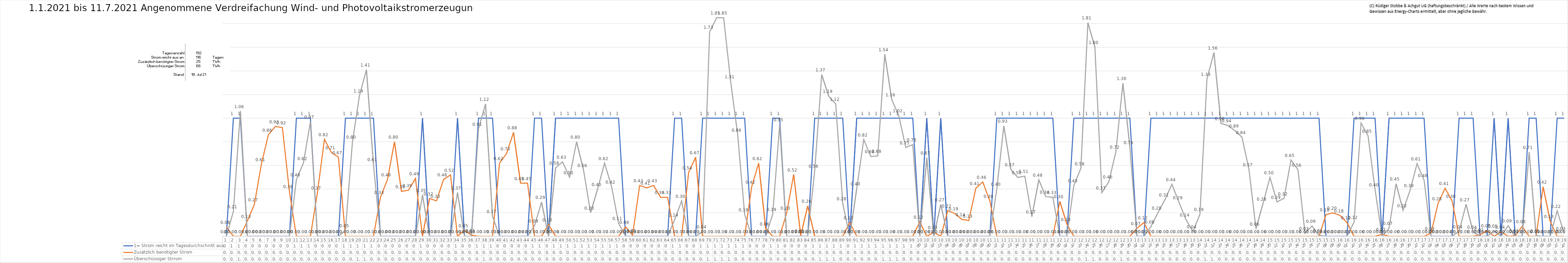
| Category | 1= Strom reicht im Tagesdurchschnitt aus | Zusätzlich benötigter Strom | Überschüssiger Strrom |
|---|---|---|---|
| 0 | 0 | 0.08 | 0 |
| 1 | 1 | 0 | 0.21 |
| 2 | 1 | 0 | 1.06 |
| 3 | 0 | 0.13 | 0 |
| 4 | 0 | 0.27 | 0 |
| 5 | 0 | 0.61 | 0 |
| 6 | 0 | 0.86 | 0 |
| 7 | 0 | 0.93 | 0 |
| 8 | 0 | 0.92 | 0 |
| 9 | 0 | 0.38 | 0 |
| 10 | 1 | 0 | 0.48 |
| 11 | 1 | 0 | 0.62 |
| 12 | 1 | 0 | 0.97 |
| 13 | 0 | 0.37 | 0 |
| 14 | 0 | 0.82 | 0 |
| 15 | 0 | 0.71 | 0 |
| 16 | 0 | 0.67 | 0 |
| 17 | 1 | 0 | 0.05 |
| 18 | 1 | 0 | 0.8 |
| 19 | 1 | 0 | 1.19 |
| 20 | 1 | 0 | 1.41 |
| 21 | 1 | 0 | 0.61 |
| 22 | 0 | 0.33 | 0 |
| 23 | 0 | 0.48 | 0 |
| 24 | 0 | 0.8 | 0 |
| 25 | 0 | 0.38 | 0 |
| 26 | 0 | 0.39 | 0 |
| 27 | 0 | 0.49 | 0 |
| 28 | 1 | 0 | 0.35 |
| 29 | 0 | 0.32 | 0 |
| 30 | 0 | 0.3 | 0 |
| 31 | 0 | 0.48 | 0 |
| 32 | 0 | 0.52 | 0 |
| 33 | 1 | 0 | 0.37 |
| 34 | 0 | 0.05 | 0 |
| 35 | 0 | 0.01 | 0 |
| 36 | 1 | 0 | 0.91 |
| 37 | 1 | 0 | 1.12 |
| 38 | 1 | 0 | 0.17 |
| 39 | 0 | 0.62 | 0 |
| 40 | 0 | 0.7 | 0 |
| 41 | 0 | 0.88 | 0 |
| 42 | 0 | 0.45 | 0 |
| 43 | 0 | 0.45 | 0 |
| 44 | 1 | 0 | 0.09 |
| 45 | 1 | 0 | 0.29 |
| 46 | 0 | 0.1 | 0 |
| 47 | 1 | 0 | 0.58 |
| 48 | 1 | 0 | 0.63 |
| 49 | 1 | 0 | 0.5 |
| 50 | 1 | 0 | 0.8 |
| 51 | 1 | 0 | 0.56 |
| 52 | 1 | 0 | 0.2 |
| 53 | 1 | 0 | 0.4 |
| 54 | 1 | 0 | 0.62 |
| 55 | 1 | 0 | 0.42 |
| 56 | 1 | 0 | 0.11 |
| 57 | 0 | 0.08 | 0 |
| 58 | 0 | 0.01 | 0 |
| 59 | 0 | 0.43 | 0 |
| 60 | 0 | 0.41 | 0 |
| 61 | 0 | 0.43 | 0 |
| 62 | 0 | 0.33 | 0 |
| 63 | 0 | 0.33 | 0 |
| 64 | 1 | 0 | 0.14 |
| 65 | 1 | 0 | 0.3 |
| 66 | 0 | 0.54 | 0 |
| 67 | 0 | 0.67 | 0 |
| 68 | 1 | 0 | 0.04 |
| 69 | 1 | 0 | 1.73 |
| 70 | 1 | 0 | 1.85 |
| 71 | 1 | 0 | 1.85 |
| 72 | 1 | 0 | 1.31 |
| 73 | 1 | 0 | 0.861 |
| 74 | 1 | 0 | 0.185 |
| 75 | 0 | 0.42 | 0 |
| 76 | 0 | 0.619 | 0 |
| 77 | 0 | 0.064 | 0 |
| 78 | 1 | 0 | 0.187 |
| 79 | 1 | 0 | 0.946 |
| 80 | 0 | 0.198 | 0 |
| 81 | 0 | 0.523 | 0 |
| 82 | 0 | 0.007 | 0 |
| 83 | 0 | 0.257 | 0 |
| 84 | 1 | 0 | 0.555 |
| 85 | 1 | 0 | 1.369 |
| 86 | 1 | 0 | 1.186 |
| 87 | 1 | 0 | 1.12 |
| 88 | 1 | 0 | 0.278 |
| 89 | 0 | 0.117 | 0 |
| 90 | 1 | 0 | 0.403 |
| 91 | 1 | 0 | 0.819 |
| 92 | 1 | 0 | 0.676 |
| 93 | 1 | 0 | 0.681 |
| 94 | 1 | 0 | 1.541 |
| 95 | 1 | 0 | 1.158 |
| 96 | 1 | 0 | 1.022 |
| 97 | 1 | 0 | 0.752 |
| 98 | 1 | 0 | 0.776 |
| 99 | 0 | 0.123 | 0 |
| 100 | 1 | 0 | 0.665 |
| 101 | 0 | 0.034 | 0 |
| 102 | 1 | 0 | 0.269 |
| 103 | 0 | 0.218 | 0 |
| 104 | 0 | 0.193 | 0 |
| 105 | 0 | 0.144 | 0 |
| 106 | 0 | 0.133 | 0 |
| 107 | 0 | 0.407 | 0 |
| 108 | 0 | 0.46 | 0 |
| 109 | 0 | 0.3 | 0 |
| 110 | 1 | 0 | 0.402 |
| 111 | 1 | 0 | 0.934 |
| 112 | 1 | 0 | 0.567 |
| 113 | 1 | 0 | 0.498 |
| 114 | 1 | 0 | 0.509 |
| 115 | 1 | 0 | 0.167 |
| 116 | 1 | 0 | 0.478 |
| 117 | 1 | 0 | 0.336 |
| 118 | 1 | 0 | 0.331 |
| 119 | 0 | 0.296 | 0 |
| 120 | 0 | 0.103 | 0 |
| 121 | 1 | 0 | 0.432 |
| 122 | 1 | 0 | 0.575 |
| 123 | 1 | 0 | 1.808 |
| 124 | 1 | 0 | 1.602 |
| 125 | 1 | 0 | 0.369 |
| 126 | 1 | 0 | 0.463 |
| 127 | 1 | 0 | 0.716 |
| 128 | 1 | 0 | 1.296 |
| 129 | 1 | 0 | 0.755 |
| 130 | 0 | 0.067 | 0 |
| 131 | 0 | 0.117 | 0 |
| 132 | 1 | 0 | 0.081 |
| 133 | 1 | 0 | 0.2 |
| 134 | 1 | 0 | 0.31 |
| 135 | 1 | 0 | 0.44 |
| 136 | 1 | 0 | 0.289 |
| 137 | 1 | 0 | 0.142 |
| 138 | 1 | 0 | 0.041 |
| 139 | 1 | 0 | 0.186 |
| 140 | 1 | 0 | 1.332 |
| 141 | 1 | 0 | 1.555 |
| 142 | 1 | 0 | 0.955 |
| 143 | 1 | 0 | 0.938 |
| 144 | 1 | 0 | 0.894 |
| 145 | 1 | 0 | 0.838 |
| 146 | 1 | 0 | 0.567 |
| 147 | 1 | 0 | 0.064 |
| 148 | 1 | 0 | 0.276 |
| 149 | 1 | 0 | 0.498 |
| 150 | 1 | 0 | 0.292 |
| 151 | 1 | 0 | 0.321 |
| 152 | 1 | 0 | 0.646 |
| 153 | 1 | 0 | 0.563 |
| 154 | 1 | 0 | 0.026 |
| 155 | 1 | 0 | 0.087 |
| 156 | 1 | 0 | 0.009 |
| 157 | 0 | 0.184 | 0 |
| 158 | 0 | 0.199 | 0 |
| 159 | 0 | 0.177 | 0 |
| 160 | 0 | 0.116 | 0 |
| 161 | 1 | 0 | 0.12 |
| 162 | 1 | 0 | 0.959 |
| 163 | 1 | 0 | 0.851 |
| 164 | 1 | 0 | 0.397 |
| 165 | 0 | 0.017 | 0 |
| 166 | 1 | 0 | 0.069 |
| 167 | 1 | 0 | 0.445 |
| 168 | 1 | 0 | 0.221 |
| 169 | 1 | 0 | 0.389 |
| 170 | 1 | 0 | 0.615 |
| 171 | 1 | 0 | 0.476 |
| 172 | 0 | 0.027 | 0 |
| 173 | 0 | 0.28 | 0 |
| 174 | 0 | 0.406 | 0 |
| 175 | 0 | 0.3 | 0 |
| 176 | 1 | 0 | 0.042 |
| 177 | 1 | 0 | 0.271 |
| 178 | 1 | 0 | 0.038 |
| 179 | 0 | 0.014 | 0 |
| 180 | 0 | 0.049 | 0 |
| 181 | 1 | 0 | 0.046 |
| 182 | 0 | 0.038 | 0 |
| 183 | 1 | 0 | 0.09 |
| 184 | 0 | 0.005 | 0 |
| 185 | 0 | 0.084 | 0 |
| 186 | 1 | 0 | 0.711 |
| 187 | 1 | 0 | 0.006 |
| 188 | 0 | 0.419 | 0 |
| 189 | 0 | 0.129 | 0 |
| 190 | 1 | 0 | 0.215 |
| 191 | 1 | 0 | 0.026 |